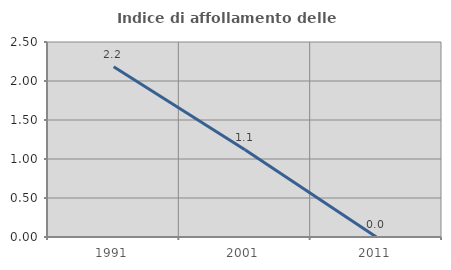
| Category | Indice di affollamento delle abitazioni  |
|---|---|
| 1991.0 | 2.182 |
| 2001.0 | 1.119 |
| 2011.0 | 0 |